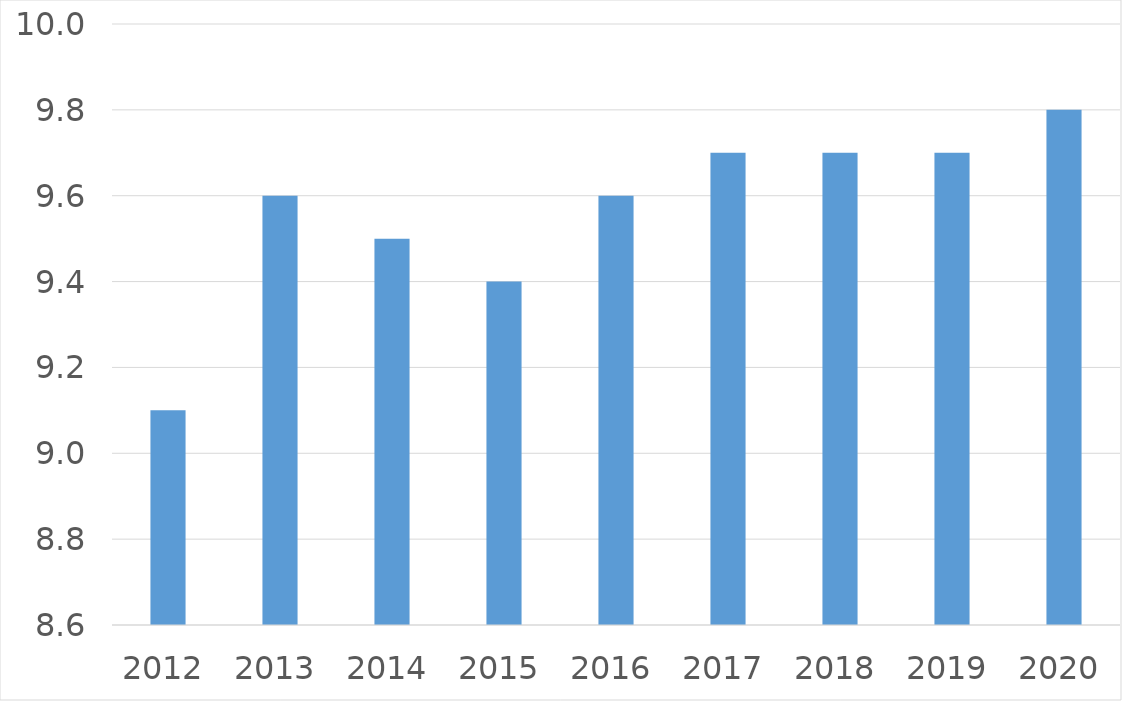
| Category | Series 0 |
|---|---|
| 2012 | 9.1 |
| 2013 | 9.6 |
| 2014 | 9.5 |
| 2015 | 9.4 |
| 2016 | 9.6 |
| 2017 | 9.7 |
| 2018 | 9.7 |
| 2019 | 9.7 |
| 2020 | 9.8 |